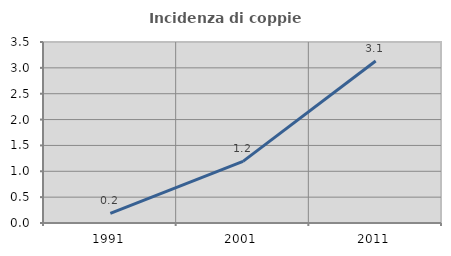
| Category | Incidenza di coppie miste |
|---|---|
| 1991.0 | 0.187 |
| 2001.0 | 1.192 |
| 2011.0 | 3.132 |